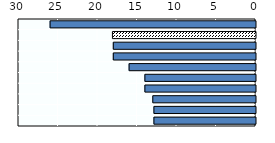
| Category | Length in weeks |
|---|---|
| Viet Nam | 26 |
| OECD average | 18.109 |
| Australia | 18 |
| New Zealand | 18 |
| Singapore | 16 |
| China | 14 |
| Japan | 14 |
| Indonesia | 13 |
| Korea | 12.857 |
| Thailand | 12.857 |